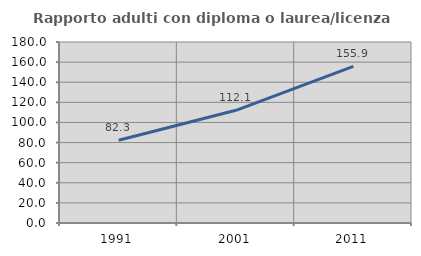
| Category | Rapporto adulti con diploma o laurea/licenza media  |
|---|---|
| 1991.0 | 82.32 |
| 2001.0 | 112.06 |
| 2011.0 | 155.851 |